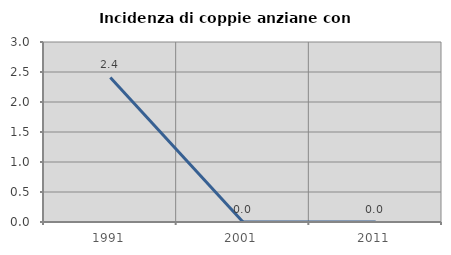
| Category | Incidenza di coppie anziane con figli |
|---|---|
| 1991.0 | 2.41 |
| 2001.0 | 0 |
| 2011.0 | 0 |